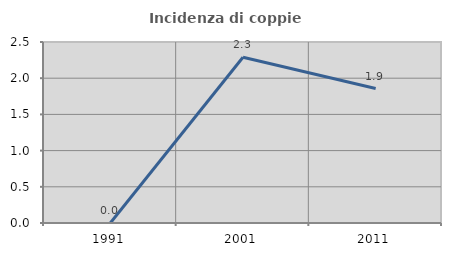
| Category | Incidenza di coppie miste |
|---|---|
| 1991.0 | 0 |
| 2001.0 | 2.29 |
| 2011.0 | 1.857 |